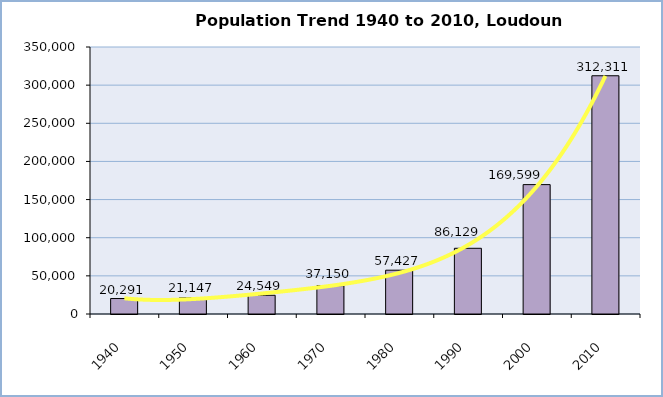
| Category | Population |
|---|---|
| 1940.0 | 20291 |
| 1950.0 | 21147 |
| 1960.0 | 24549 |
| 1970.0 | 37150 |
| 1980.0 | 57427 |
| 1990.0 | 86129 |
| 2000.0 | 169599 |
| 2010.0 | 312311 |